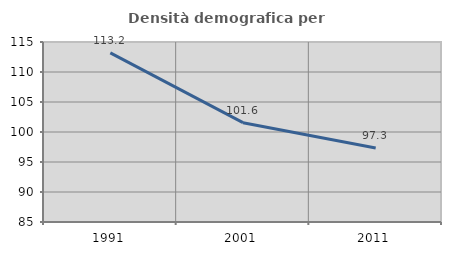
| Category | Densità demografica |
|---|---|
| 1991.0 | 113.179 |
| 2001.0 | 101.555 |
| 2011.0 | 97.341 |